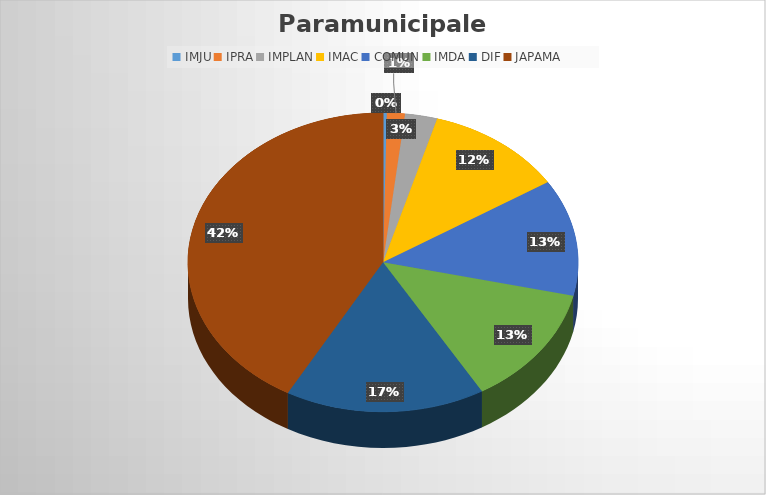
| Category | Suma  |
|---|---|
| IMJU | 41103 |
| IPRA | 195000 |
| IMPLAN | 350000 |
| IMAC | 1507956.5 |
| COMUN | 1649415.48 |
| IMDA | 1695525.36 |
| DIF | 2166667 |
| JAPAMA | 5484298.79 |